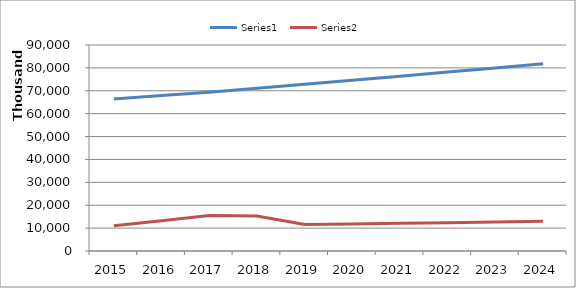
| Category | Series 0 | Series 1 |
|---|---|---|
| 2015.0 | 66408957 | 11071417 |
| 2016.0 | 67936363 | 13222617 |
| 2017.0 | 69363027 | 15498842 |
| 2018.0 | 71097103 | 15273813 |
| 2019.0 | 72803433 | 11544385 |
| 2020.0 | 74550715 | 11821450 |
| 2021.0 | 76339932 | 12105165 |
| 2022.0 | 78172090 | 12395689 |
| 2023.0 | 79970048 | 12680790 |
| 2024.0 | 81809359 | 12972448 |